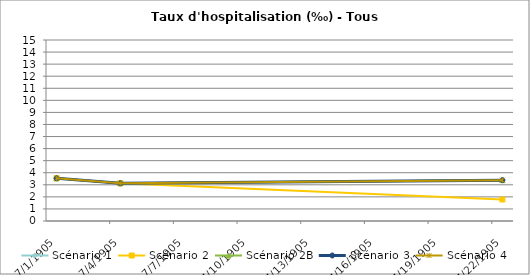
| Category | Scénario 1 | Scénario 2 | Scénario 2B | Scénario 3 | Scénario 4 |
|---|---|---|---|---|---|
| 2009.0 | 3.541 | 3.541 | 3.541 | 3.541 | 3.541 |
| 2012.0 | 3.128 | 3.128 | 3.128 | 3.128 | 3.128 |
| 2030.0 | 3.385 | 1.782 | 3.385 | 3.385 | 3.385 |